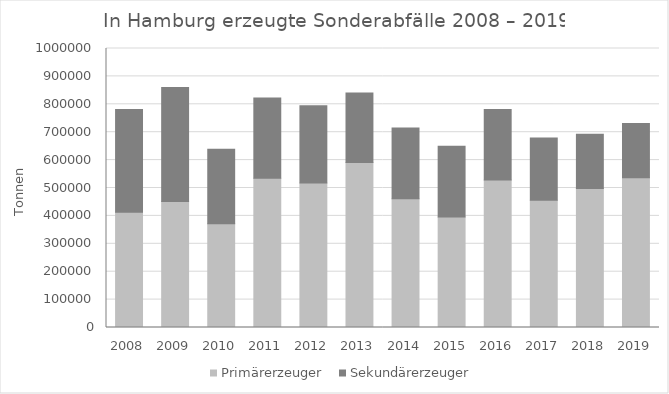
| Category | Primärerzeuger | Sekundärerzeuger |
|---|---|---|
| 2008.0 | 412719 | 368718 |
| 2009.0 | 452024 | 407812 |
| 2010.0 | 371926 | 266534 |
| 2011.0 | 535192 | 287739 |
| 2012.0 | 518083 | 276594 |
| 2013.0 | 591315 | 249291 |
| 2014.0 | 461117 | 253893 |
| 2015.0 | 396331 | 253506 |
| 2016.0 | 528687 | 252656 |
| 2017.0 | 455741 | 223764 |
| 2018.0 | 497812 | 195188 |
| 2019.0 | 536439 | 195089 |